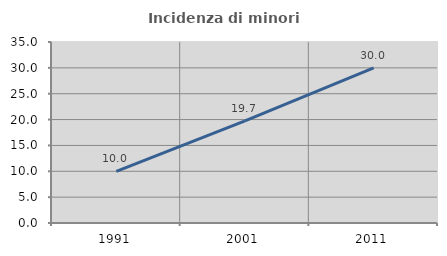
| Category | Incidenza di minori stranieri |
|---|---|
| 1991.0 | 10 |
| 2001.0 | 19.737 |
| 2011.0 | 30 |